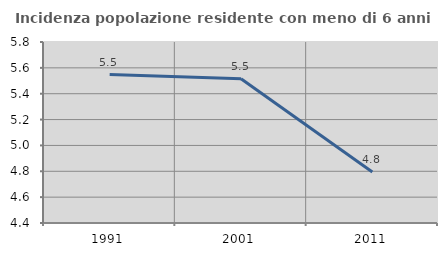
| Category | Incidenza popolazione residente con meno di 6 anni |
|---|---|
| 1991.0 | 5.548 |
| 2001.0 | 5.516 |
| 2011.0 | 4.795 |